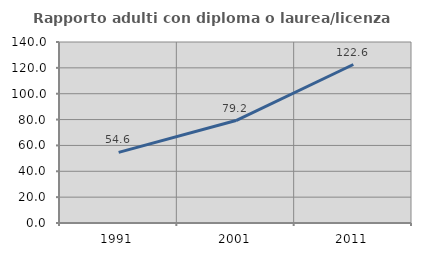
| Category | Rapporto adulti con diploma o laurea/licenza media  |
|---|---|
| 1991.0 | 54.596 |
| 2001.0 | 79.237 |
| 2011.0 | 122.587 |